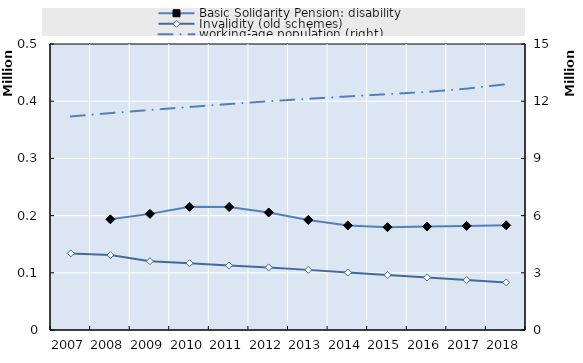
| Category | Basic Solidarity Pension: disability | Invalidity (old schemes) |
|---|---|---|
| 2007.0 | 0 | 133957.833 |
| 2008.0 | 193452.5 | 130948.083 |
| 2009.0 | 203022.75 | 120372.917 |
| 2010.0 | 215261.167 | 116829 |
| 2011.0 | 214992.5 | 112777.835 |
| 2012.0 | 205472.167 | 109422.169 |
| 2013.0 | 192414.583 | 105113.25 |
| 2014.0 | 182901.917 | 100527.75 |
| 2015.0 | 179760.75 | 96110.167 |
| 2016.0 | 180992.417 | 91763.25 |
| 2017.0 | 182016 | 87431.5 |
| 2018.0 | 182976.417 | 83250.5 |